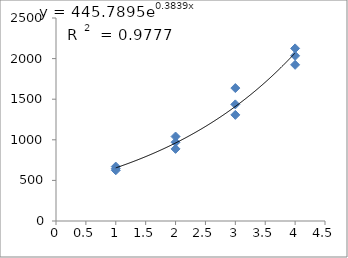
| Category | Series 0 |
|---|---|
| 1.0 | 624.818 |
| 1.0 | 644.343 |
| 1.0 | 670.377 |
| 2.0 | 970.35 |
| 2.0 | 887.902 |
| 2.0 | 1040.114 |
| 3.0 | 1637.155 |
| 3.0 | 1436.101 |
| 3.0 | 1306.852 |
| 4.0 | 2125.582 |
| 4.0 | 1923.457 |
| 4.0 | 2034.3 |